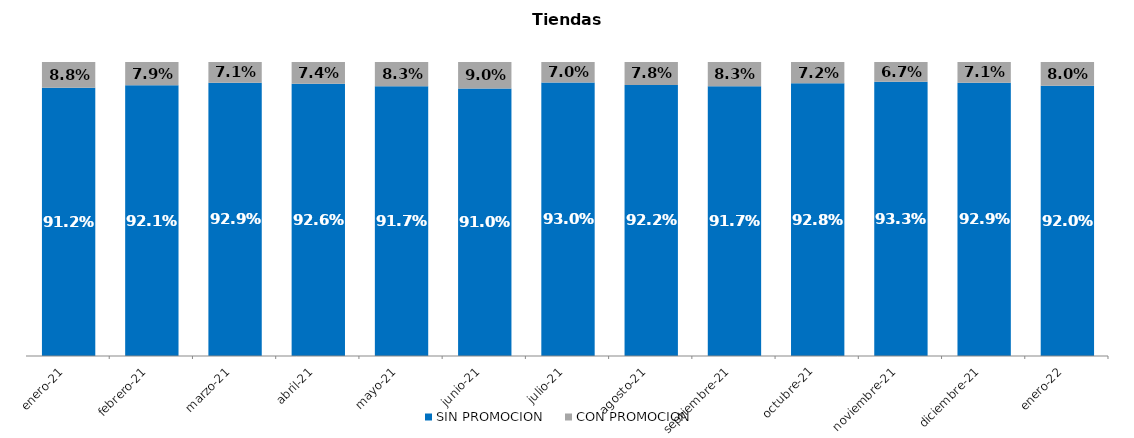
| Category | SIN PROMOCION   | CON PROMOCION   |
|---|---|---|
| 2021-01-01 | 0.912 | 0.088 |
| 2021-02-01 | 0.921 | 0.079 |
| 2021-03-01 | 0.929 | 0.071 |
| 2021-04-01 | 0.926 | 0.074 |
| 2021-05-01 | 0.917 | 0.083 |
| 2021-06-01 | 0.91 | 0.09 |
| 2021-07-01 | 0.93 | 0.07 |
| 2021-08-01 | 0.922 | 0.078 |
| 2021-09-01 | 0.917 | 0.083 |
| 2021-10-01 | 0.928 | 0.072 |
| 2021-11-01 | 0.933 | 0.067 |
| 2021-12-01 | 0.929 | 0.071 |
| 2022-01-01 | 0.92 | 0.08 |